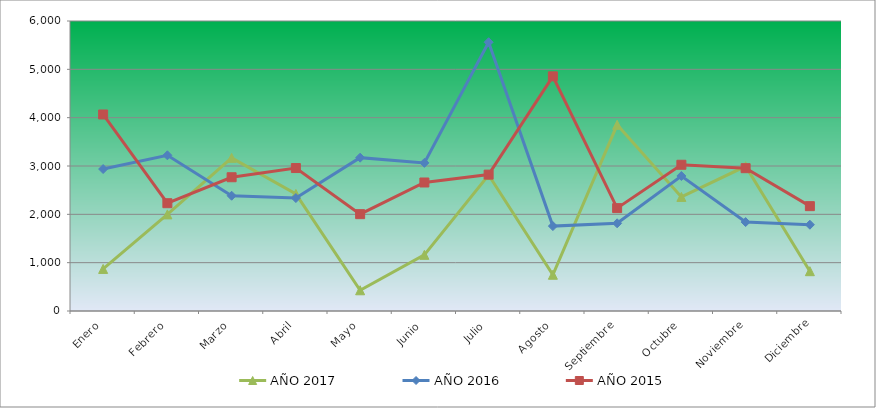
| Category | AÑO 2017 | AÑO 2016 | AÑO 2015 |
|---|---|---|---|
| Enero | 870.503 | 2936.925 | 4066.135 |
| Febrero | 1999.017 | 3221.399 | 2230.255 |
| Marzo | 3168.295 | 2384.608 | 2767.42 |
| Abril | 2422.932 | 2336.915 | 2957.807 |
| Mayo | 428.834 | 3172.641 | 2003.579 |
| Junio | 1161.675 | 3064.595 | 2658.627 |
| Julio | 2812.655 | 5560.349 | 2821.816 |
| Agosto | 749.931 | 1756.364 | 4854.884 |
| Septiembre | 3851.321 | 1814.482 | 2128.261 |
| Octubre | 2360.614 | 2793.397 | 3025.694 |
| Noviembre | 2994.353 | 1839.49 | 2955.033 |
| Diciembre | 823.868 | 1785.049 | 2169.214 |